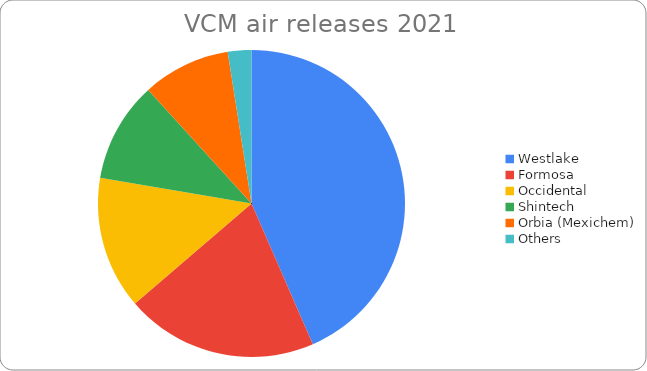
| Category | VCM air releases 2021 |
|---|---|
| Westlake | 185807 |
| Formosa | 86595 |
| Occidental | 59679 |
| Shintech | 45250 |
| Orbia (Mexichem) | 39603 |
| Others | 10604 |